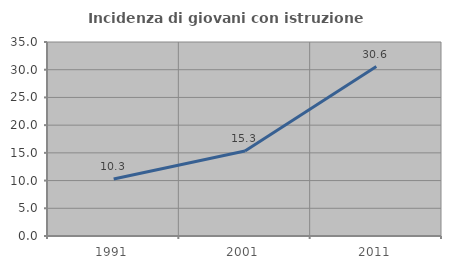
| Category | Incidenza di giovani con istruzione universitaria |
|---|---|
| 1991.0 | 10.286 |
| 2001.0 | 15.342 |
| 2011.0 | 30.566 |